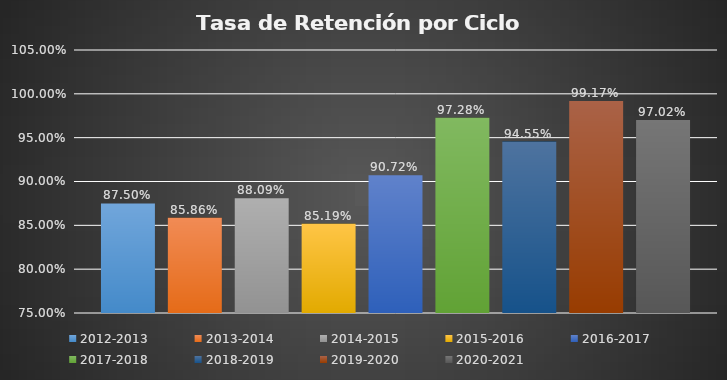
| Category | 2012-2013 | 2013-2014 | 2014-2015 | 2015-2016  | 2016-2017 | 2017-2018 | 2018-2019 | 2019-2020 | 2020-2021 |
|---|---|---|---|---|---|---|---|---|---|
| 0 | 0.875 | 0.859 | 0.881 | 0.852 | 0.907 | 0.973 | 0.946 | 0.992 | 0.97 |